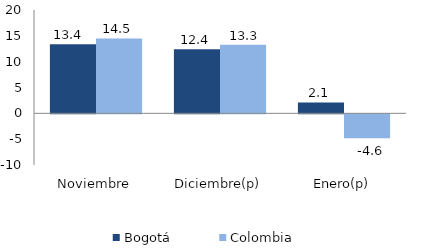
| Category | Bogotá | Colombia |
|---|---|---|
| Noviembre | 13.359 | 14.507 |
| Diciembre(p) | 12.38 | 13.258 |
| Enero(p) | 2.098 | -4.611 |